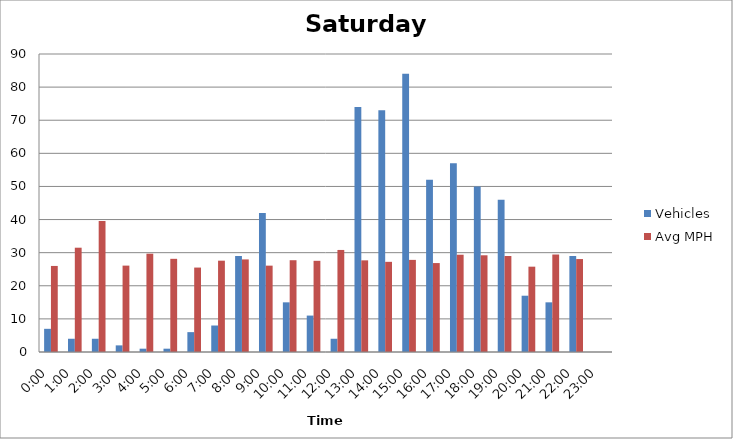
| Category | Vehicles | Avg MPH |
|---|---|---|
| 0:00 | 7 | 25.99 |
| 1:00 | 4 | 31.5 |
| 2:00 | 4 | 39.53 |
| 3:00 | 2 | 26.09 |
| 4:00 | 1 | 29.69 |
| 5:00 | 1 | 28.14 |
| 6:00 | 6 | 25.5 |
| 7:00 | 8 | 27.58 |
| 8:00 | 29 | 27.96 |
| 9:00 | 42 | 26.08 |
| 10:00 | 15 | 27.72 |
| 11:00 | 11 | 27.54 |
| 12:00 | 4 | 30.82 |
| 13:00 | 74 | 27.68 |
| 14:00 | 73 | 27.23 |
| 15:00 | 84 | 27.82 |
| 16:00 | 52 | 26.86 |
| 17:00 | 57 | 29.38 |
| 18:00 | 50 | 29.21 |
| 19:00 | 46 | 29 |
| 20:00 | 17 | 25.77 |
| 21:00 | 15 | 29.44 |
| 22:00 | 29 | 28.07 |
| 23:00 | 0 | 0 |